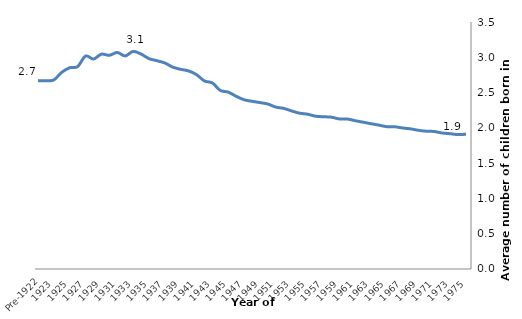
| Category | Series 0 |
|---|---|
| 1975 | 1.91 |
| 1974 | 1.904 |
| 1973 | 1.917 |
| 1972 | 1.927 |
| 1971 | 1.948 |
| 1970 | 1.952 |
| 1969 | 1.965 |
| 1968 | 1.986 |
| 1967 | 1.998 |
| 1966 | 2.016 |
| 1965 | 2.017 |
| 1964 | 2.039 |
| 1963 | 2.059 |
| 1962 | 2.081 |
| 1961 | 2.102 |
| 1960 | 2.125 |
| 1959 | 2.127 |
| 1958 | 2.152 |
| 1957 | 2.157 |
| 1956 | 2.166 |
| 1955 | 2.194 |
| 1954 | 2.208 |
| 1953 | 2.24 |
| 1952 | 2.276 |
| 1951 | 2.294 |
| 1950 | 2.338 |
| 1949 | 2.358 |
| 1948 | 2.376 |
| 1947 | 2.399 |
| 1946 | 2.447 |
| 1945 | 2.506 |
| 1944 | 2.531 |
| 1943 | 2.636 |
| 1942 | 2.665 |
| 1941 | 2.754 |
| 1940 | 2.807 |
| 1939 | 2.829 |
| 1938 | 2.861 |
| 1937 | 2.919 |
| 1936 | 2.952 |
| 1935 | 2.981 |
| 1934 | 3.046 |
| 1933 | 3.083 |
| 1932 | 3.019 |
| 1931 | 3.068 |
| 1930 | 3.028 |
| 1929 | 3.044 |
| 1928 | 2.975 |
| 1927 | 3.017 |
| 1926 | 2.868 |
| 1925 | 2.852 |
| 1924 | 2.787 |
| 1923 | 2.679 |
| 1922 | 2.667 |
| Pre-1922 | 2.669 |